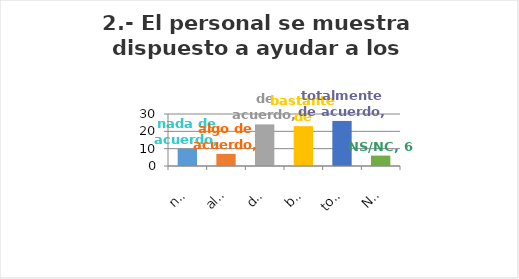
| Category | Series 0 |
|---|---|
| nada de acuerdo | 10 |
| algo de acuerdo | 7 |
| de acuerdo | 24 |
| bastante de acuerdo | 23 |
| totalmente de acuerdo | 26 |
| NS/NC | 6 |